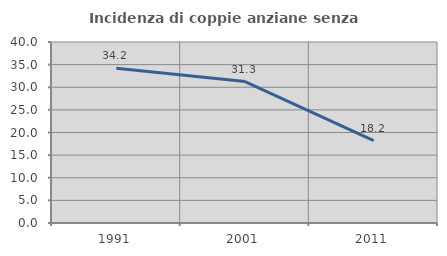
| Category | Incidenza di coppie anziane senza figli  |
|---|---|
| 1991.0 | 34.211 |
| 2001.0 | 31.25 |
| 2011.0 | 18.182 |